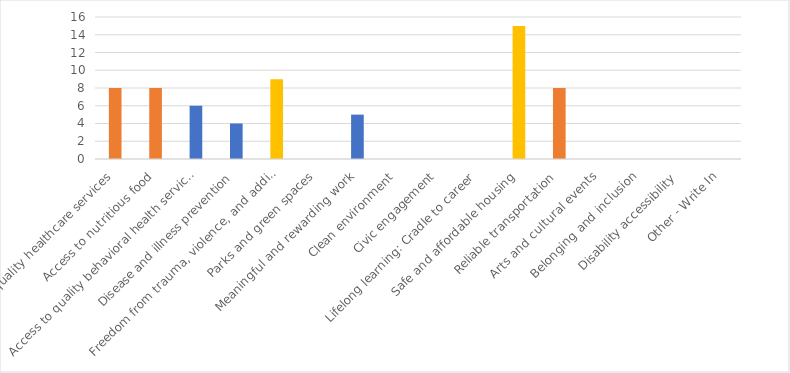
| Category | Number of Responses |
|---|---|
| Access to quality healthcare services | 8 |
| Access to nutritious food | 8 |
| Access to quality behavioral health services | 6 |
| Disease and illness prevention | 4 |
| Freedom from trauma, violence, and addiction | 9 |
| Parks and green spaces | 0 |
| Meaningful and rewarding work | 5 |
| Clean environment | 0 |
| Civic engagement | 0 |
| Lifelong learning: Cradle to career | 0 |
| Safe and affordable housing | 15 |
| Reliable transportation | 8 |
| Arts and cultural events | 0 |
| Belonging and inclusion | 0 |
| Disability accessibility | 0 |
| Other - Write In | 0 |